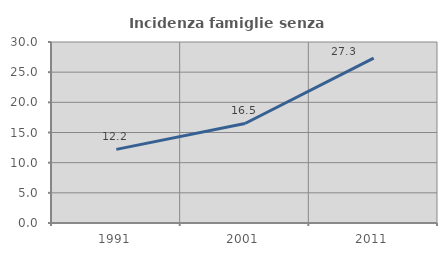
| Category | Incidenza famiglie senza nuclei |
|---|---|
| 1991.0 | 12.2 |
| 2001.0 | 16.496 |
| 2011.0 | 27.317 |